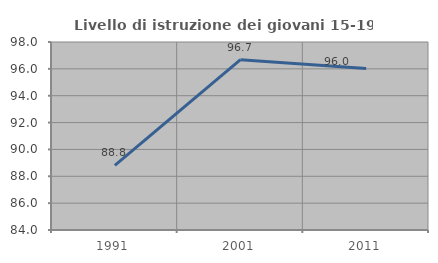
| Category | Livello di istruzione dei giovani 15-19 anni |
|---|---|
| 1991.0 | 88.813 |
| 2001.0 | 96.687 |
| 2011.0 | 96.021 |